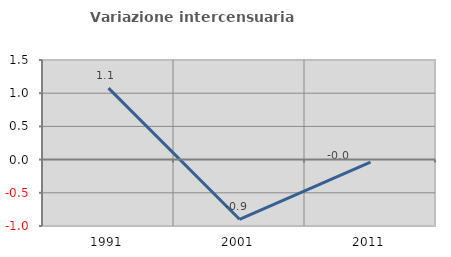
| Category | Variazione intercensuaria annua |
|---|---|
| 1991.0 | 1.077 |
| 2001.0 | -0.899 |
| 2011.0 | -0.039 |